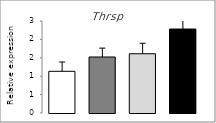
| Category | Series 0 |
|---|---|
| 0 | 1.133 |
| 1 | 1.522 |
| 2 | 1.61 |
| 3 | 2.282 |